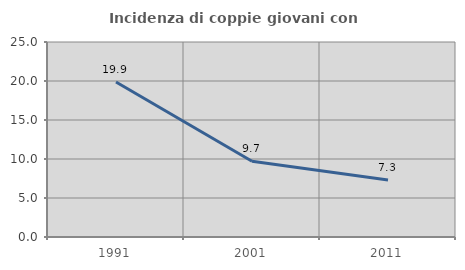
| Category | Incidenza di coppie giovani con figli |
|---|---|
| 1991.0 | 19.873 |
| 2001.0 | 9.717 |
| 2011.0 | 7.299 |